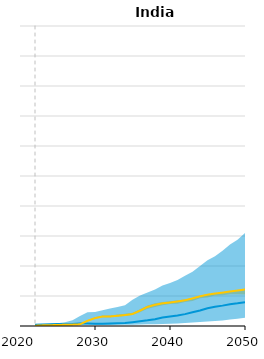
| Category | BEV_ref | PHEV_ref |
|---|---|---|
| 2022.0 | 0.004 | 0.001 |
| 2023.0 | 0.005 | 0.002 |
| 2024.0 | 0.005 | 0.003 |
| 2025.0 | 0.006 | 0.003 |
| 2026.0 | 0.006 | 0.004 |
| 2027.0 | 0.007 | 0.005 |
| 2028.0 | 0.008 | 0.006 |
| 2029.0 | 0.008 | 0.017 |
| 2030.0 | 0.007 | 0.026 |
| 2031.0 | 0.008 | 0.032 |
| 2032.0 | 0.009 | 0.032 |
| 2033.0 | 0.009 | 0.034 |
| 2034.0 | 0.01 | 0.036 |
| 2035.0 | 0.013 | 0.04 |
| 2036.0 | 0.016 | 0.051 |
| 2037.0 | 0.019 | 0.064 |
| 2038.0 | 0.023 | 0.071 |
| 2039.0 | 0.028 | 0.076 |
| 2040.0 | 0.031 | 0.078 |
| 2041.0 | 0.035 | 0.082 |
| 2042.0 | 0.04 | 0.086 |
| 2043.0 | 0.046 | 0.092 |
| 2044.0 | 0.052 | 0.099 |
| 2045.0 | 0.059 | 0.104 |
| 2046.0 | 0.064 | 0.108 |
| 2047.0 | 0.068 | 0.111 |
| 2048.0 | 0.073 | 0.115 |
| 2049.0 | 0.076 | 0.118 |
| 2050.0 | 0.079 | 0.122 |